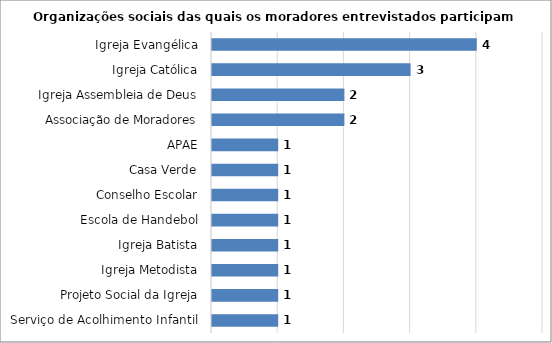
| Category | Series 0 |
|---|---|
| Serviço de Acolhimento Infantil | 1 |
| Projeto Social da Igreja | 1 |
| Igreja Metodista | 1 |
| Igreja Batista | 1 |
| Escola de Handebol | 1 |
| Conselho Escolar | 1 |
| Casa Verde | 1 |
| APAE | 1 |
| Associação de Moradores | 2 |
| Igreja Assembleia de Deus | 2 |
| Igreja Católica | 3 |
| Igreja Evangélica | 4 |